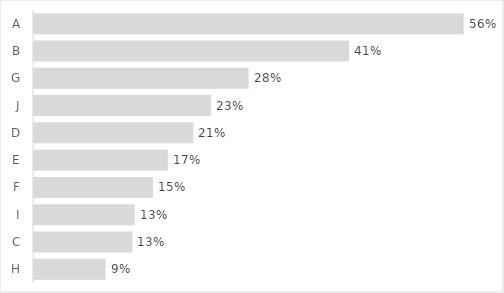
| Category | Series 0 |
|---|---|
| H | 0.093 |
| C | 0.128 |
| I | 0.131 |
| F | 0.155 |
| E | 0.174 |
| D | 0.207 |
| J | 0.23 |
| G | 0.279 |
| B | 0.41 |
| A | 0.559 |